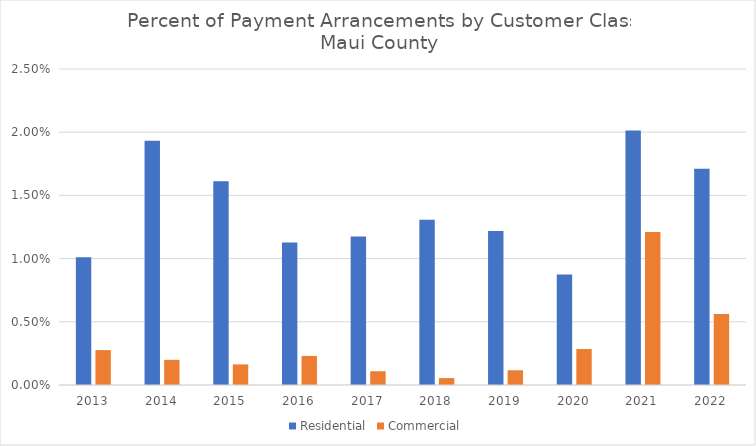
| Category | Residential | Commercial |
|---|---|---|
| 2013.0 | 0.01 | 0.003 |
| 2014.0 | 0.019 | 0.002 |
| 2015.0 | 0.016 | 0.002 |
| 2016.0 | 0.011 | 0.002 |
| 2017.0 | 0.012 | 0.001 |
| 2018.0 | 0.013 | 0.001 |
| 2019.0 | 0.012 | 0.001 |
| 2020.0 | 0.009 | 0.003 |
| 2021.0 | 0.02 | 0.012 |
| 2022.0 | 0.017 | 0.006 |